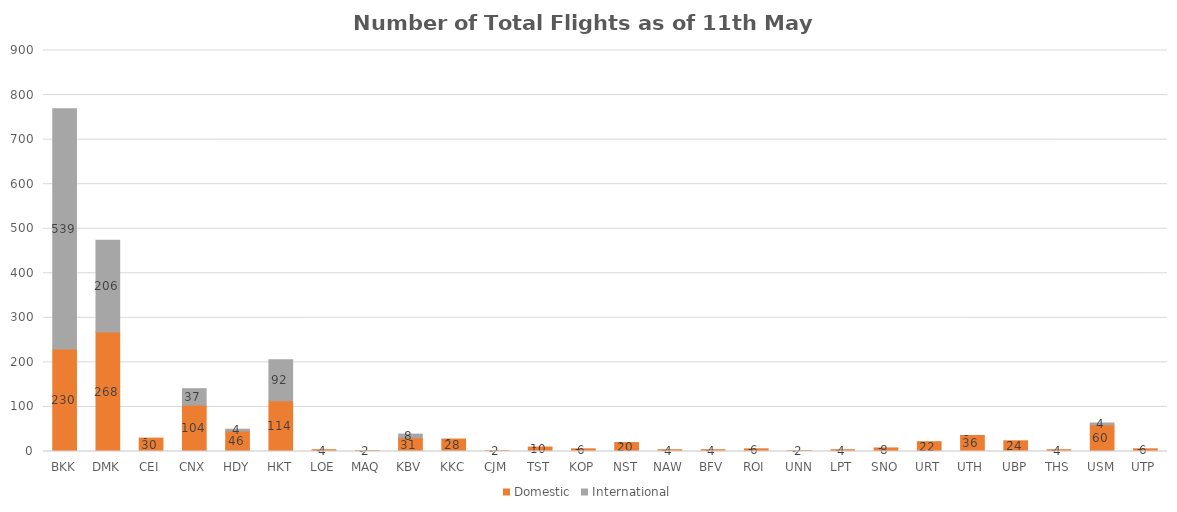
| Category | Domestic | International |
|---|---|---|
| BKK | 230 | 539 |
| DMK | 268 | 206 |
| CEI | 30 | 0 |
| CNX | 104 | 37 |
| HDY | 46 | 4 |
| HKT | 114 | 92 |
| LOE | 4 | 0 |
| MAQ | 2 | 0 |
| KBV | 31 | 8 |
| KKC | 28 | 0 |
| CJM | 2 | 0 |
| TST | 10 | 0 |
| KOP | 6 | 0 |
| NST | 20 | 0 |
| NAW | 4 | 0 |
| BFV | 4 | 0 |
| ROI | 6 | 0 |
| UNN | 2 | 0 |
| LPT | 4 | 0 |
| SNO | 8 | 0 |
| URT | 22 | 0 |
| UTH | 36 | 0 |
| UBP | 24 | 0 |
| THS | 4 | 0 |
| USM | 60 | 4 |
| UTP | 6 | 0 |